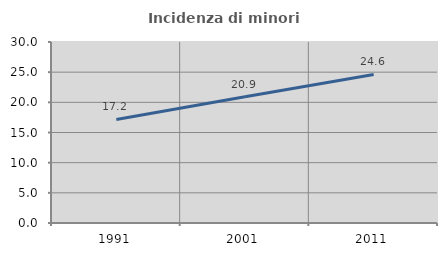
| Category | Incidenza di minori stranieri |
|---|---|
| 1991.0 | 17.162 |
| 2001.0 | 20.936 |
| 2011.0 | 24.615 |